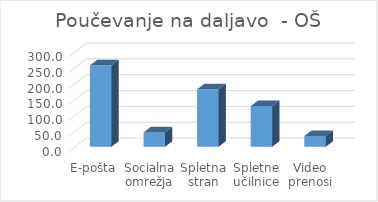
| Category | Series 0 |
|---|---|
| E-pošta | 256.727 |
| Socialna omrežja | 45.364 |
| Spletna stran | 181.455 |
| Spletne učilnice | 128.091 |
| Video prenosi | 34.182 |